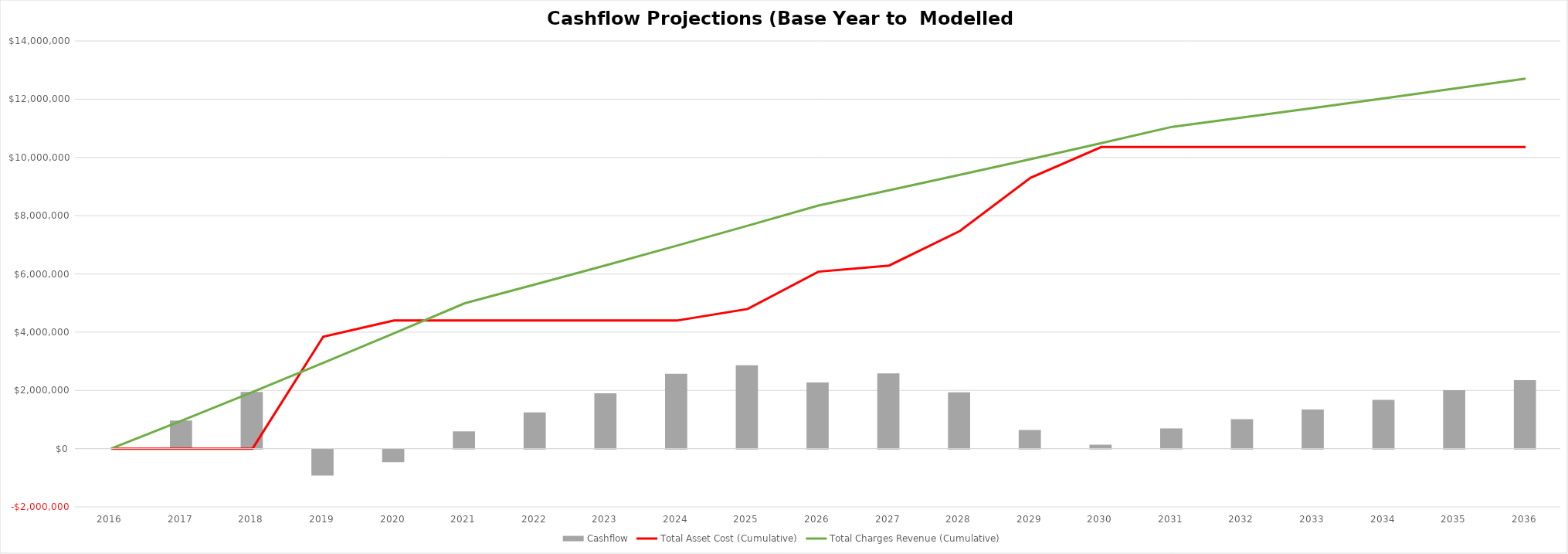
| Category | Cashflow |
|---|---|
| 0 | 0 |
| 1 | 963794.804 |
| 2 | 1944552.397 |
| 3 | -901927.817 |
| 4 | -440107.337 |
| 5 | 593351.002 |
| 6 | 1241690.754 |
| 7 | 1901441.286 |
| 8 | 2572803.428 |
| 9 | 2859282.79 |
| 10 | 2272693.625 |
| 11 | 2584338.432 |
| 12 | 1930467.828 |
| 13 | 640342.614 |
| 14 | 135249.683 |
| 15 | 694458.723 |
| 16 | 1014687.006 |
| 17 | 1340551.306 |
| 18 | 1672150.818 |
| 19 | 2009586.481 |
| 20 | 2352961.012 |